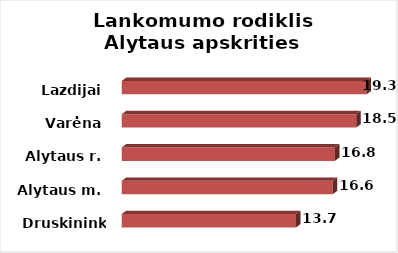
| Category | Series 0 |
|---|---|
| Druskininkai | 13.73 |
| Alytaus m. | 16.63 |
| Alytaus r. | 16.79 |
| Varėna | 18.47 |
| Lazdijai | 19.29 |